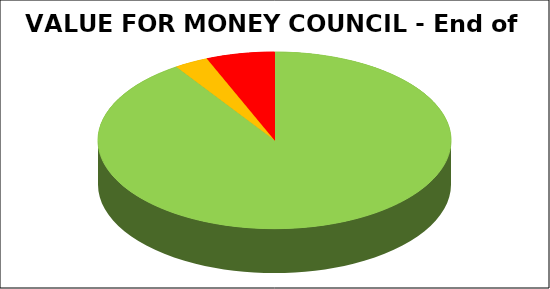
| Category | Series 0 |
|---|---|
| Green | 0.892 |
| Amber | 0.031 |
| Red | 0.062 |